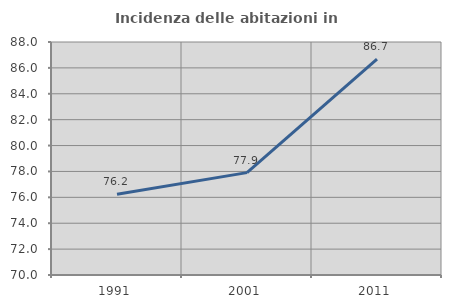
| Category | Incidenza delle abitazioni in proprietà  |
|---|---|
| 1991.0 | 76.231 |
| 2001.0 | 77.91 |
| 2011.0 | 86.685 |